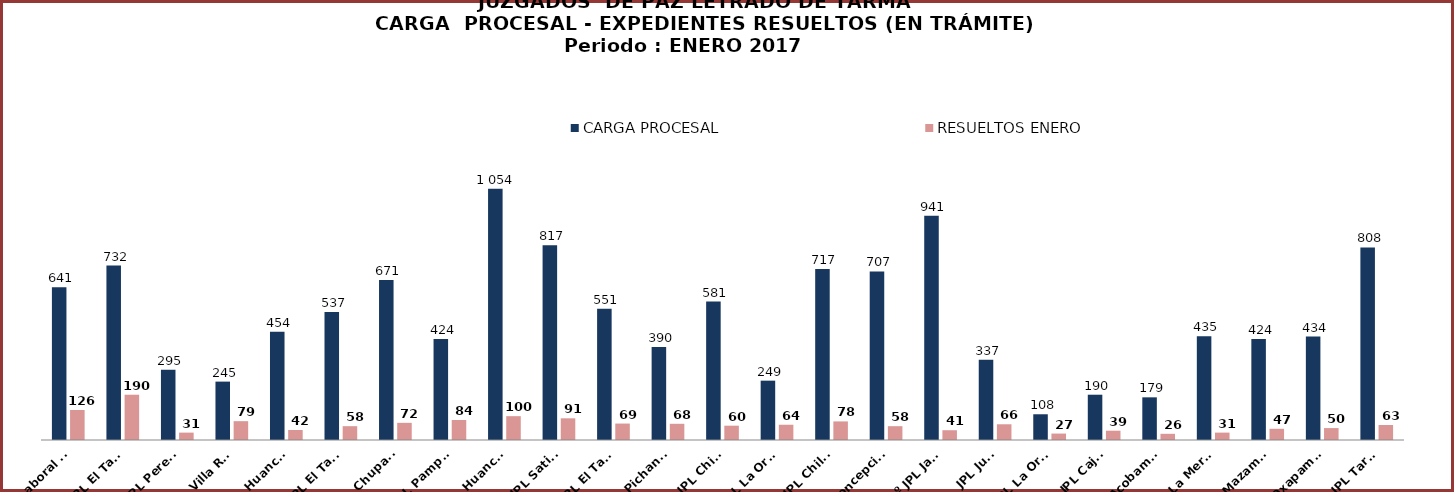
| Category | CARGA PROCESAL | RESUELTOS ENERO |
|---|---|---|
| JPL Laboral Hyo | 641 | 126 |
| 3º JPL El Tambo | 732 | 190 |
| JPL Perene | 295 | 31 |
| JPL Villa Rica | 245 | 79 |
| 1º JPL Huancayo | 454 | 42 |
| 1º JPL El Tambo | 537 | 58 |
| JPL Chupaca | 671 | 72 |
| JPL Pampas | 424 | 84 |
| 2º JPL Huancayo | 1054 | 100 |
| JPL Satipo | 817 | 91 |
| 2º JPL El Tambo | 551 | 69 |
| JPL Pichanaki | 390 | 68 |
| 2º JPL Chilca | 581 | 60 |
| 1° JPL La Oroya | 249 | 64 |
| 1° JPL Chilca | 717 | 78 |
| JPL Concepción  | 707 | 58 |
| 1º JPL Jauja | 941 | 41 |
| JPL Junín | 337 | 66 |
| 2º JPL La Oroya | 108 | 27 |
| JPL Cajas | 190 | 39 |
| JPL Acobamba | 179 | 26 |
| 2º JPL La Merced | 435 | 31 |
| JPL Mazamari | 424 | 47 |
| JPL Oxapampa | 434 | 50 |
| JPL Tarma | 808 | 63 |